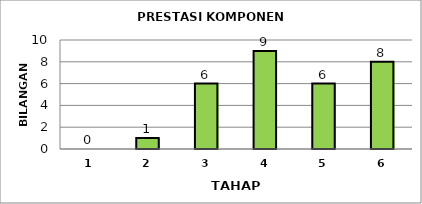
| Category | Series 0 |
|---|---|
| 1.0 | 0 |
| 2.0 | 1 |
| 3.0 | 6 |
| 4.0 | 9 |
| 5.0 | 6 |
| 6.0 | 8 |